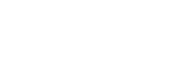
| Category | Series 1 |
|---|---|
| 0 | 0 |